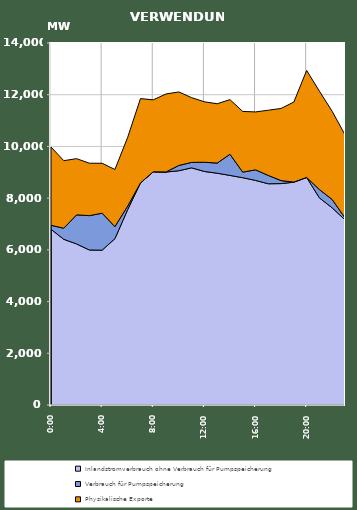
| Category | Inlandstromverbrauch ohne Verbrauch für Pumpspeicherung | Verbrauch für Pumpspeicherung | Physikalische Exporte |
|---|---|---|---|
| 2007-01-17 | 6794.625 | 155.467 | 3026.526 |
| 2007-01-17 01:00:00 | 6408.076 | 429.061 | 2612.597 |
| 2007-01-17 02:00:00 | 6228.91 | 1125.7 | 2172.749 |
| 2007-01-17 03:00:00 | 5995.138 | 1327.611 | 2028.885 |
| 2007-01-17 04:00:00 | 5987.344 | 1430.698 | 1931.357 |
| 2007-01-17 05:00:00 | 6431.505 | 467.936 | 2208.346 |
| 2007-01-17 06:00:00 | 7557.442 | 137.223 | 2658.521 |
| 2007-01-17 07:00:00 | 8589.484 | 0.524 | 3260.171 |
| 2007-01-17 08:00:00 | 9019.482 | 0.553 | 2782.029 |
| 2007-01-17 09:00:00 | 9010.205 | 2.924 | 3015.652 |
| 2007-01-17 10:00:00 | 9059.434 | 203.276 | 2845.075 |
| 2007-01-17 11:00:00 | 9171.975 | 210.212 | 2503.972 |
| 2007-01-17 12:00:00 | 9031.649 | 356.96 | 2337.195 |
| 2007-01-17 13:00:00 | 8964.516 | 391.344 | 2294.902 |
| 2007-01-17 14:00:00 | 8878.787 | 818.185 | 2112.522 |
| 2007-01-17 15:00:00 | 8790.237 | 215.789 | 2347.727 |
| 2007-01-17 16:00:00 | 8685.512 | 409.505 | 2239.349 |
| 2007-01-17 17:00:00 | 8555.569 | 321.425 | 2523.961 |
| 2007-01-17 18:00:00 | 8562.671 | 115.494 | 2790.553 |
| 2007-01-17 19:00:00 | 8617.285 | 3.604 | 3097.753 |
| 2007-01-17 20:00:00 | 8799.15 | 3.63 | 4134.944 |
| 2007-01-17 21:00:00 | 8010.092 | 321.682 | 3804.953 |
| 2007-01-17 22:00:00 | 7625.176 | 321.391 | 3409.319 |
| 2007-01-17 23:00:00 | 7159.712 | 77.719 | 3213.053 |